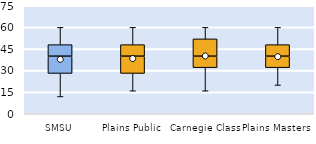
| Category | 25th | 50th | 75th |
|---|---|---|---|
| SMSU | 28 | 12 | 8 |
| Plains Public | 28 | 12 | 8 |
| Carnegie Class | 32 | 8 | 12 |
| Plains Masters | 32 | 8 | 8 |